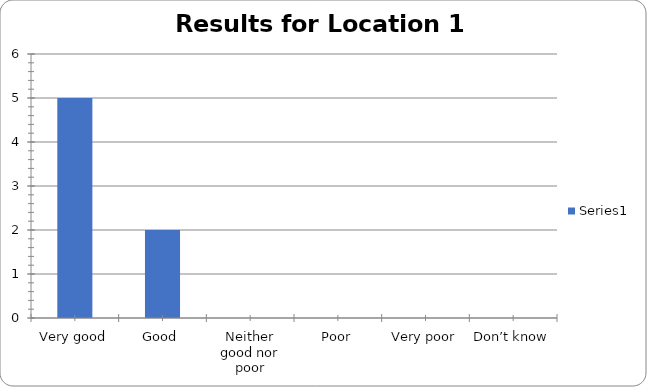
| Category | Series 0 |
|---|---|
| Very good | 5 |
| Good | 2 |
| Neither good nor poor | 0 |
| Poor | 0 |
| Very poor | 0 |
| Don’t know | 0 |